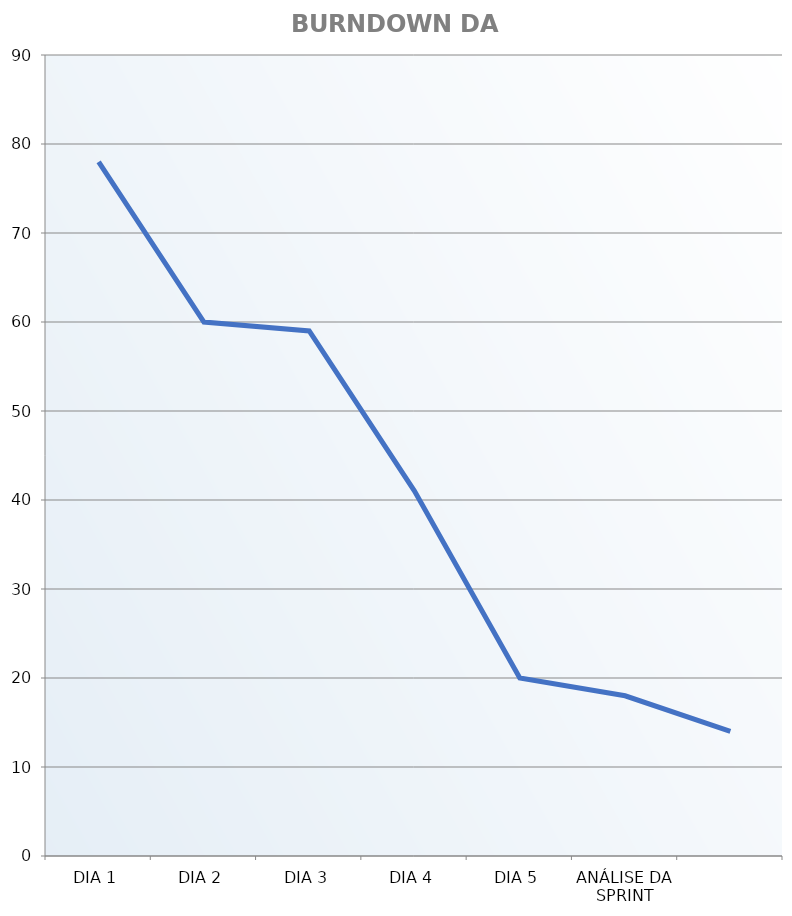
| Category | Gráfico de burndown da sprint |
|---|---|
| DIA 1 | 78 |
| DIA 2 | 60 |
| DIA 3 | 59 |
| DIA 4 | 41 |
| DIA 5 | 20 |
| ANÁLISE DA SPRINT | 18 |